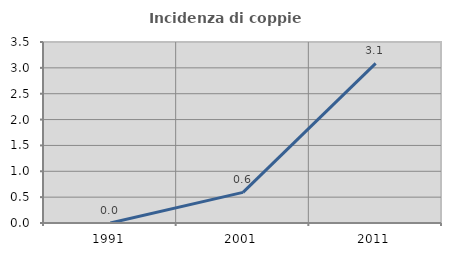
| Category | Incidenza di coppie miste |
|---|---|
| 1991.0 | 0 |
| 2001.0 | 0.592 |
| 2011.0 | 3.086 |